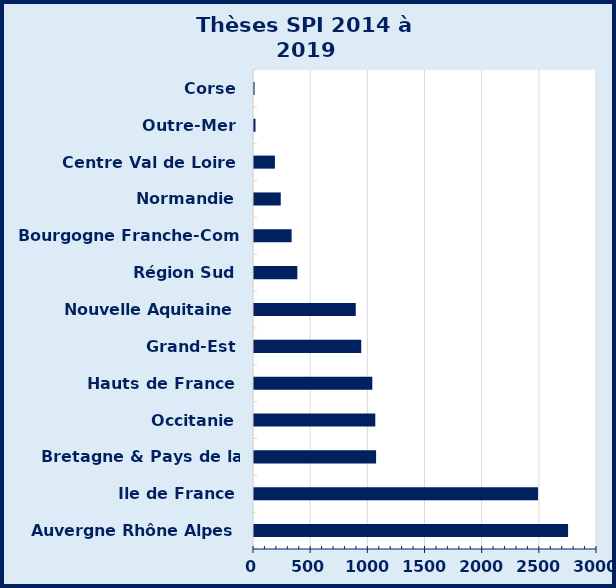
| Category | Series 0 |
|---|---|
| Auvergne Rhône Alpes | 2747 |
| Ile de France | 2484 |
| Bretagne & Pays de la Loire | 1068 |
| Occitanie | 1061 |
| Hauts de France | 1035 |
| Grand-Est | 938 |
| Nouvelle Aquitaine | 890 |
| Région Sud | 379 |
| Bourgogne Franche-Comté | 329 |
| Normandie | 234 |
| Centre Val de Loire​ | 183 |
| Outre-Mer | 13 |
| Corse | 5 |